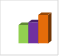
| Category | област Враца |
|---|---|
| летен сезон 2019  | 27360 |
| летен сезон 2021  | 31430 |
| летен сезон 2022 г.  | 42333 |